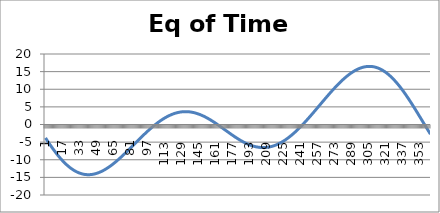
| Category | Eq of Time (minutes) |
|---|---|
| 0 | -3.802 |
| 1 | -4.266 |
| 2 | -4.724 |
| 3 | -5.175 |
| 4 | -5.62 |
| 5 | -6.057 |
| 6 | -6.486 |
| 7 | -6.906 |
| 8 | -7.318 |
| 9 | -7.721 |
| 10 | -8.114 |
| 11 | -8.498 |
| 12 | -8.871 |
| 13 | -9.233 |
| 14 | -9.584 |
| 15 | -9.924 |
| 16 | -10.253 |
| 17 | -10.57 |
| 18 | -10.874 |
| 19 | -11.167 |
| 20 | -11.447 |
| 21 | -11.714 |
| 22 | -11.968 |
| 23 | -12.209 |
| 24 | -12.437 |
| 25 | -12.651 |
| 26 | -12.852 |
| 27 | -13.04 |
| 28 | -13.213 |
| 29 | -13.374 |
| 30 | -13.52 |
| 31 | -13.653 |
| 32 | -13.772 |
| 33 | -13.877 |
| 34 | -13.969 |
| 35 | -14.047 |
| 36 | -14.112 |
| 37 | -14.163 |
| 38 | -14.201 |
| 39 | -14.225 |
| 40 | -14.237 |
| 41 | -14.235 |
| 42 | -14.221 |
| 43 | -14.194 |
| 44 | -14.154 |
| 45 | -14.103 |
| 46 | -14.039 |
| 47 | -13.964 |
| 48 | -13.877 |
| 49 | -13.778 |
| 50 | -13.669 |
| 51 | -13.548 |
| 52 | -13.417 |
| 53 | -13.276 |
| 54 | -13.124 |
| 55 | -12.963 |
| 56 | -12.793 |
| 57 | -12.613 |
| 58 | -12.425 |
| 59 | -12.228 |
| 60 | -12.022 |
| 61 | -11.809 |
| 62 | -11.588 |
| 63 | -11.36 |
| 64 | -11.125 |
| 65 | -10.884 |
| 66 | -10.636 |
| 67 | -10.382 |
| 68 | -10.123 |
| 69 | -9.859 |
| 70 | -9.589 |
| 71 | -9.315 |
| 72 | -9.037 |
| 73 | -8.755 |
| 74 | -8.47 |
| 75 | -8.181 |
| 76 | -7.89 |
| 77 | -7.596 |
| 78 | -7.299 |
| 79 | -7.002 |
| 80 | -6.702 |
| 81 | -6.402 |
| 82 | -6.1 |
| 83 | -5.798 |
| 84 | -5.496 |
| 85 | -5.195 |
| 86 | -4.893 |
| 87 | -4.593 |
| 88 | -4.294 |
| 89 | -3.996 |
| 90 | -3.7 |
| 91 | -3.406 |
| 92 | -3.114 |
| 93 | -2.826 |
| 94 | -2.54 |
| 95 | -2.257 |
| 96 | -1.979 |
| 97 | -1.704 |
| 98 | -1.433 |
| 99 | -1.167 |
| 100 | -0.905 |
| 101 | -0.649 |
| 102 | -0.398 |
| 103 | -0.152 |
| 104 | 0.088 |
| 105 | 0.322 |
| 106 | 0.549 |
| 107 | 0.77 |
| 108 | 0.984 |
| 109 | 1.192 |
| 110 | 1.392 |
| 111 | 1.584 |
| 112 | 1.769 |
| 113 | 1.947 |
| 114 | 2.116 |
| 115 | 2.277 |
| 116 | 2.43 |
| 117 | 2.574 |
| 118 | 2.71 |
| 119 | 2.837 |
| 120 | 2.955 |
| 121 | 3.064 |
| 122 | 3.164 |
| 123 | 3.255 |
| 124 | 3.336 |
| 125 | 3.409 |
| 126 | 3.471 |
| 127 | 3.525 |
| 128 | 3.569 |
| 129 | 3.603 |
| 130 | 3.628 |
| 131 | 3.643 |
| 132 | 3.649 |
| 133 | 3.645 |
| 134 | 3.632 |
| 135 | 3.609 |
| 136 | 3.577 |
| 137 | 3.536 |
| 138 | 3.486 |
| 139 | 3.427 |
| 140 | 3.359 |
| 141 | 3.282 |
| 142 | 3.197 |
| 143 | 3.103 |
| 144 | 3.001 |
| 145 | 2.891 |
| 146 | 2.772 |
| 147 | 2.647 |
| 148 | 2.514 |
| 149 | 2.373 |
| 150 | 2.226 |
| 151 | 2.072 |
| 152 | 1.912 |
| 153 | 1.746 |
| 154 | 1.574 |
| 155 | 1.396 |
| 156 | 1.213 |
| 157 | 1.026 |
| 158 | 0.834 |
| 159 | 0.637 |
| 160 | 0.437 |
| 161 | 0.234 |
| 162 | 0.027 |
| 163 | -0.182 |
| 164 | -0.394 |
| 165 | -0.608 |
| 166 | -0.823 |
| 167 | -1.039 |
| 168 | -1.257 |
| 169 | -1.474 |
| 170 | -1.692 |
| 171 | -1.909 |
| 172 | -2.126 |
| 173 | -2.341 |
| 174 | -2.555 |
| 175 | -2.767 |
| 176 | -2.976 |
| 177 | -3.183 |
| 178 | -3.387 |
| 179 | -3.587 |
| 180 | -3.784 |
| 181 | -3.976 |
| 182 | -4.164 |
| 183 | -4.346 |
| 184 | -4.524 |
| 185 | -4.696 |
| 186 | -4.862 |
| 187 | -5.022 |
| 188 | -5.175 |
| 189 | -5.322 |
| 190 | -5.462 |
| 191 | -5.594 |
| 192 | -5.718 |
| 193 | -5.835 |
| 194 | -5.943 |
| 195 | -6.043 |
| 196 | -6.135 |
| 197 | -6.218 |
| 198 | -6.292 |
| 199 | -6.356 |
| 200 | -6.412 |
| 201 | -6.458 |
| 202 | -6.495 |
| 203 | -6.521 |
| 204 | -6.538 |
| 205 | -6.546 |
| 206 | -6.543 |
| 207 | -6.53 |
| 208 | -6.507 |
| 209 | -6.474 |
| 210 | -6.431 |
| 211 | -6.378 |
| 212 | -6.315 |
| 213 | -6.241 |
| 214 | -6.158 |
| 215 | -6.064 |
| 216 | -5.96 |
| 217 | -5.847 |
| 218 | -5.723 |
| 219 | -5.59 |
| 220 | -5.447 |
| 221 | -5.295 |
| 222 | -5.133 |
| 223 | -4.962 |
| 224 | -4.781 |
| 225 | -4.592 |
| 226 | -4.394 |
| 227 | -4.187 |
| 228 | -3.971 |
| 229 | -3.748 |
| 230 | -3.516 |
| 231 | -3.276 |
| 232 | -3.028 |
| 233 | -2.773 |
| 234 | -2.511 |
| 235 | -2.241 |
| 236 | -1.965 |
| 237 | -1.682 |
| 238 | -1.393 |
| 239 | -1.098 |
| 240 | -0.797 |
| 241 | -0.49 |
| 242 | -0.178 |
| 243 | 0.139 |
| 244 | 0.461 |
| 245 | 0.787 |
| 246 | 1.117 |
| 247 | 1.451 |
| 248 | 1.789 |
| 249 | 2.13 |
| 250 | 2.474 |
| 251 | 2.821 |
| 252 | 3.17 |
| 253 | 3.521 |
| 254 | 3.874 |
| 255 | 4.229 |
| 256 | 4.584 |
| 257 | 4.94 |
| 258 | 5.297 |
| 259 | 5.654 |
| 260 | 6.011 |
| 261 | 6.367 |
| 262 | 6.723 |
| 263 | 7.077 |
| 264 | 7.43 |
| 265 | 7.781 |
| 266 | 8.129 |
| 267 | 8.476 |
| 268 | 8.819 |
| 269 | 9.159 |
| 270 | 9.496 |
| 271 | 9.829 |
| 272 | 10.157 |
| 273 | 10.481 |
| 274 | 10.8 |
| 275 | 11.114 |
| 276 | 11.422 |
| 277 | 11.725 |
| 278 | 12.021 |
| 279 | 12.31 |
| 280 | 12.592 |
| 281 | 12.867 |
| 282 | 13.135 |
| 283 | 13.394 |
| 284 | 13.646 |
| 285 | 13.888 |
| 286 | 14.122 |
| 287 | 14.347 |
| 288 | 14.561 |
| 289 | 14.766 |
| 290 | 14.961 |
| 291 | 15.146 |
| 292 | 15.319 |
| 293 | 15.482 |
| 294 | 15.633 |
| 295 | 15.773 |
| 296 | 15.901 |
| 297 | 16.017 |
| 298 | 16.121 |
| 299 | 16.212 |
| 300 | 16.29 |
| 301 | 16.355 |
| 302 | 16.408 |
| 303 | 16.446 |
| 304 | 16.472 |
| 305 | 16.484 |
| 306 | 16.482 |
| 307 | 16.466 |
| 308 | 16.436 |
| 309 | 16.392 |
| 310 | 16.333 |
| 311 | 16.261 |
| 312 | 16.174 |
| 313 | 16.073 |
| 314 | 15.958 |
| 315 | 15.828 |
| 316 | 15.684 |
| 317 | 15.525 |
| 318 | 15.353 |
| 319 | 15.166 |
| 320 | 14.966 |
| 321 | 14.751 |
| 322 | 14.523 |
| 323 | 14.28 |
| 324 | 14.025 |
| 325 | 13.756 |
| 326 | 13.474 |
| 327 | 13.18 |
| 328 | 12.873 |
| 329 | 12.553 |
| 330 | 12.222 |
| 331 | 11.878 |
| 332 | 11.524 |
| 333 | 11.158 |
| 334 | 10.782 |
| 335 | 10.395 |
| 336 | 9.998 |
| 337 | 9.592 |
| 338 | 9.177 |
| 339 | 8.753 |
| 340 | 8.32 |
| 341 | 7.88 |
| 342 | 7.433 |
| 343 | 6.978 |
| 344 | 6.518 |
| 345 | 6.051 |
| 346 | 5.579 |
| 347 | 5.102 |
| 348 | 4.621 |
| 349 | 4.137 |
| 350 | 3.648 |
| 351 | 3.158 |
| 352 | 2.665 |
| 353 | 2.17 |
| 354 | 1.675 |
| 355 | 1.179 |
| 356 | 0.683 |
| 357 | 0.188 |
| 358 | -0.306 |
| 359 | -0.799 |
| 360 | -1.289 |
| 361 | -1.776 |
| 362 | -2.26 |
| 363 | -2.74 |